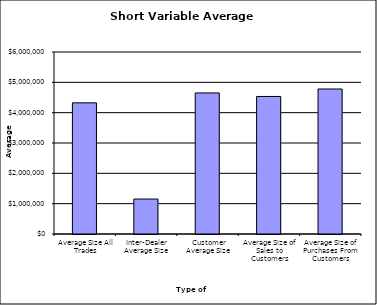
| Category | Security Type |
|---|---|
| Average Size All Trades | 4323826.683 |
| Inter-Dealer Average Size | 1153014.553 |
| Customer Average Size | 4650921.345 |
| Average Size of Sales to Customers | 4533751.583 |
| Average Size of Purchases From Customers | 4780375.353 |